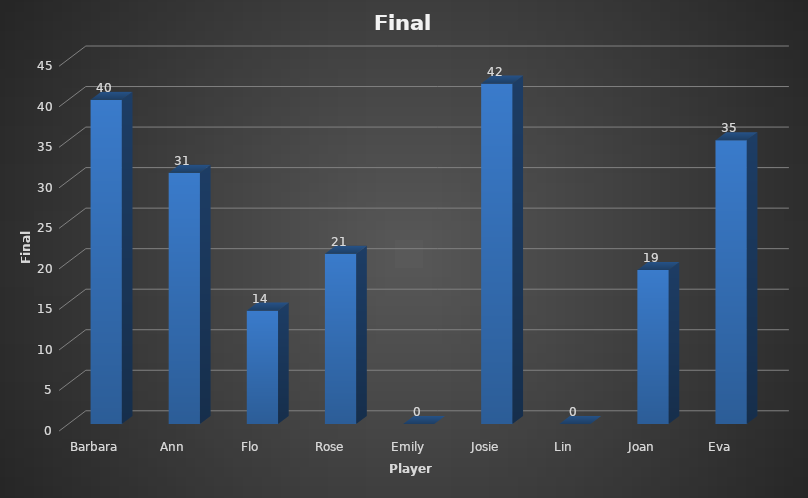
| Category | Total |
|---|---|
| Barbara  | 40 |
| Ann  | 31 |
| Flo  | 14 |
| Rose | 21 |
| Emily  | 0 |
| Josie  | 42 |
| Lin  | 0 |
| Joan  | 19 |
| Eva  | 35 |